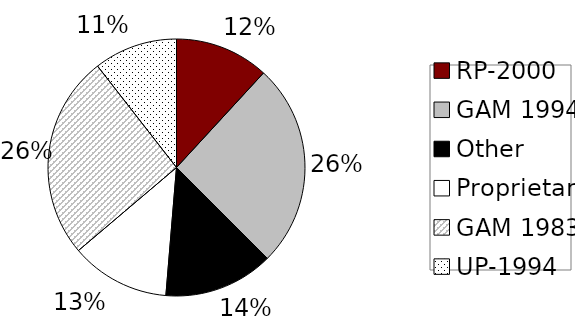
| Category | 2000 |
|---|---|
| RP-2000 | 0.118 |
| GAM 1994 | 0.257 |
| Other | 0.138 |
| Proprietary | 0.125 |
| GAM 1983 | 0.257 |
| UP-1994 | 0.105 |